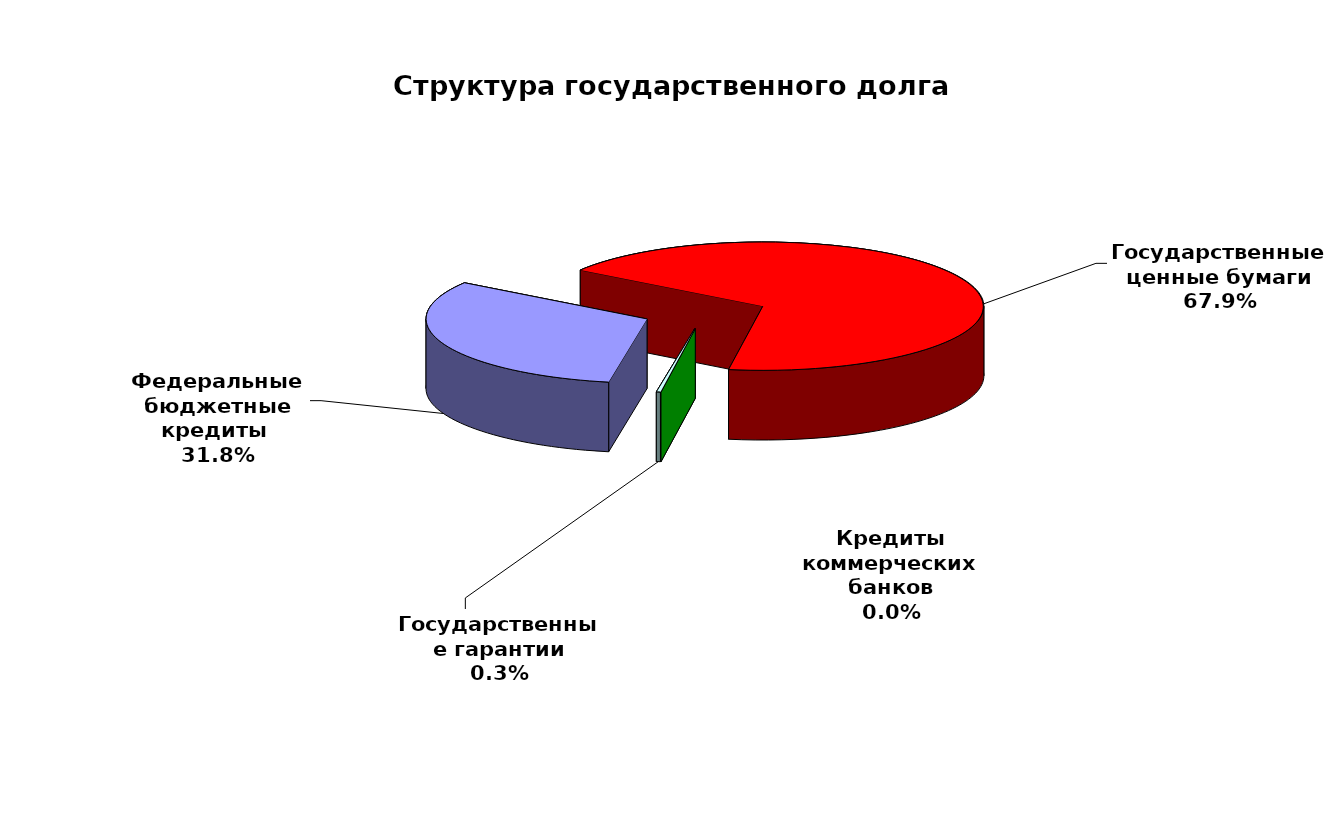
| Category | Series 0 |
|---|---|
| Федеральные бюджетные кредиты  | 19957026.213 |
| Государственные ценные бумаги | 42700000 |
| Кредиты коммерческих банков | 0 |
| Государственные гарантии | 187793.375 |